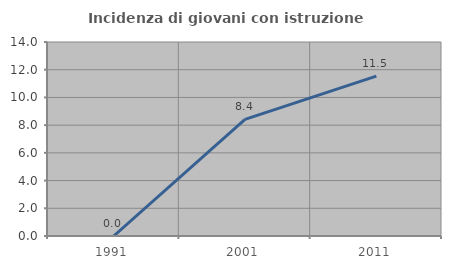
| Category | Incidenza di giovani con istruzione universitaria |
|---|---|
| 1991.0 | 0 |
| 2001.0 | 8.421 |
| 2011.0 | 11.538 |